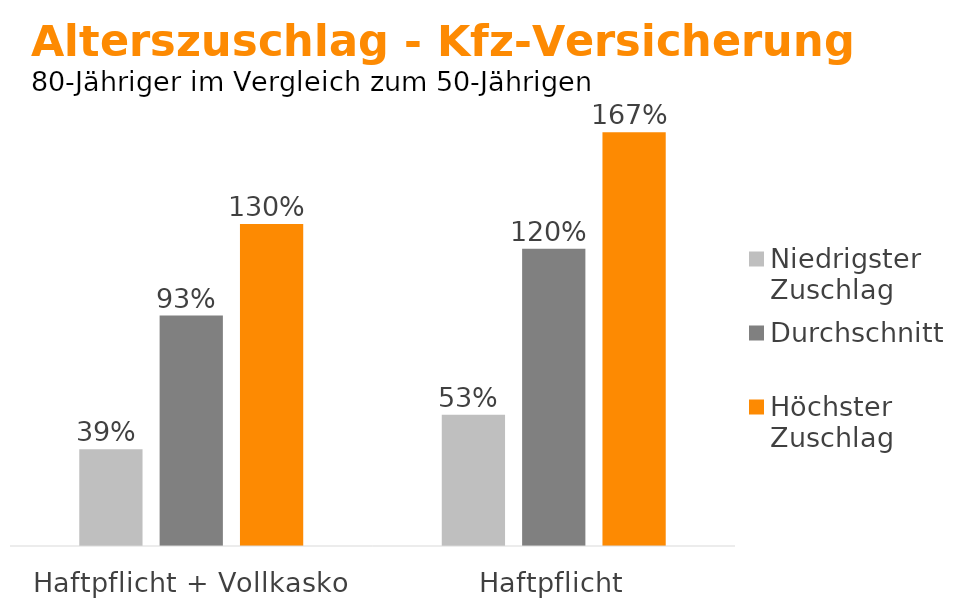
| Category | Niedrigster
Zuschlag | Durchschnitt | Höchster
Zuschlag |
|---|---|---|---|
| Haftpflicht + Vollkasko | 0.39 | 0.93 | 1.3 |
| Haftpflicht | 0.53 | 1.2 | 1.67 |